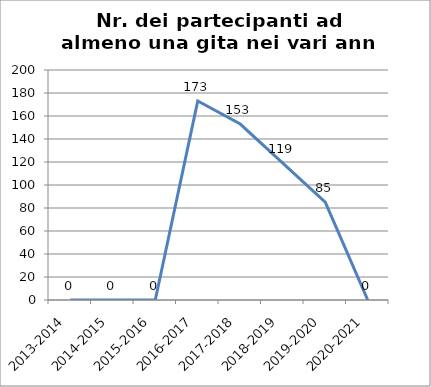
| Category | Nr. Partecipanti ad almeno una Gita |
|---|---|
| 2013-2014 | 0 |
| 2014-2015 | 0 |
| 2015-2016 | 0 |
| 2016-2017 | 173 |
| 2017-2018 | 153 |
| 2018-2019 | 119 |
| 2019-2020 | 85 |
| 2020-2021 | 0 |